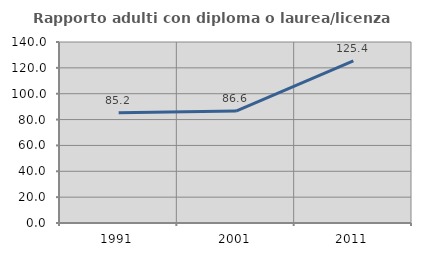
| Category | Rapporto adulti con diploma o laurea/licenza media  |
|---|---|
| 1991.0 | 85.227 |
| 2001.0 | 86.607 |
| 2011.0 | 125.397 |